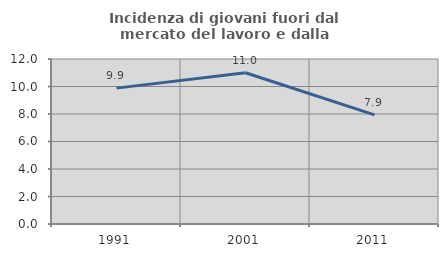
| Category | Incidenza di giovani fuori dal mercato del lavoro e dalla formazione  |
|---|---|
| 1991.0 | 9.882 |
| 2001.0 | 10.997 |
| 2011.0 | 7.937 |